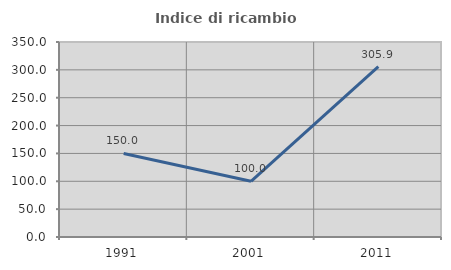
| Category | Indice di ricambio occupazionale  |
|---|---|
| 1991.0 | 150 |
| 2001.0 | 100 |
| 2011.0 | 305.882 |